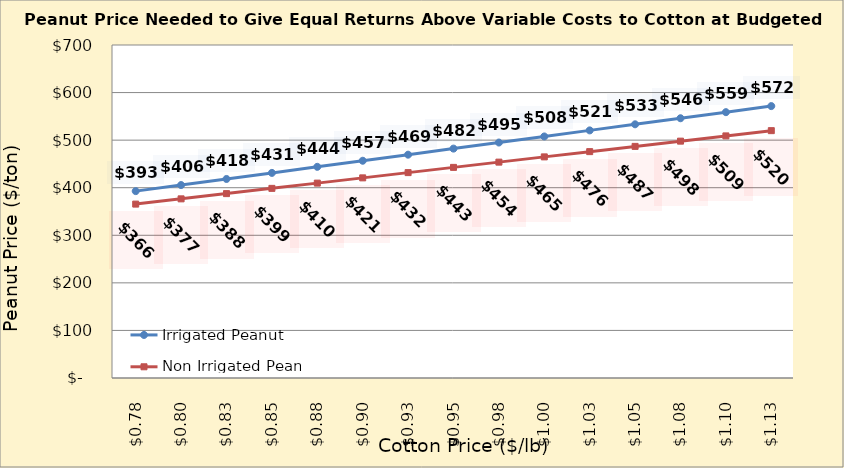
| Category | Irrigated Peanut | Non Irrigated Peanut |
|---|---|---|
| 0.7749999999999998 | 392.85 | 365.548 |
| 0.7999999999999998 | 405.616 | 376.577 |
| 0.8249999999999998 | 418.382 | 387.606 |
| 0.8499999999999999 | 431.148 | 398.636 |
| 0.8749999999999999 | 443.914 | 409.665 |
| 0.8999999999999999 | 456.68 | 420.695 |
| 0.9249999999999999 | 469.446 | 431.724 |
| 0.95 | 482.212 | 442.753 |
| 0.975 | 494.978 | 453.783 |
| 1.0 | 507.744 | 464.812 |
| 1.025 | 520.51 | 475.842 |
| 1.0499999999999998 | 533.276 | 486.871 |
| 1.0749999999999997 | 546.042 | 497.9 |
| 1.0999999999999996 | 558.808 | 508.93 |
| 1.1249999999999996 | 571.574 | 519.959 |